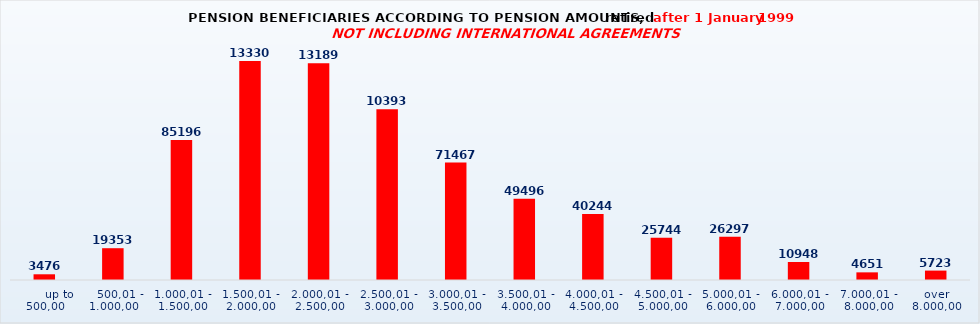
| Category | Series 0 |
|---|---|
|       up to 500,00 | 3476 |
|    500,01 - 1.000,00 | 19353 |
| 1.000,01 - 1.500,00 | 85196 |
| 1.500,01 - 2.000,00 | 133307 |
| 2.000,01 - 2.500,00 | 131891 |
| 2.500,01 - 3.000,00 | 103934 |
| 3.000,01 - 3.500,00 | 71467 |
| 3.500,01 - 4.000,00 | 49496 |
| 4.000,01 - 4.500,00 | 40244 |
| 4.500,01 - 5.000,00 | 25744 |
| 5.000,01 - 6.000,00 | 26297 |
| 6.000,01 - 7.000,00 | 10948 |
| 7.000,01 - 8.000,00 | 4651 |
| over 8.000,00 | 5723 |